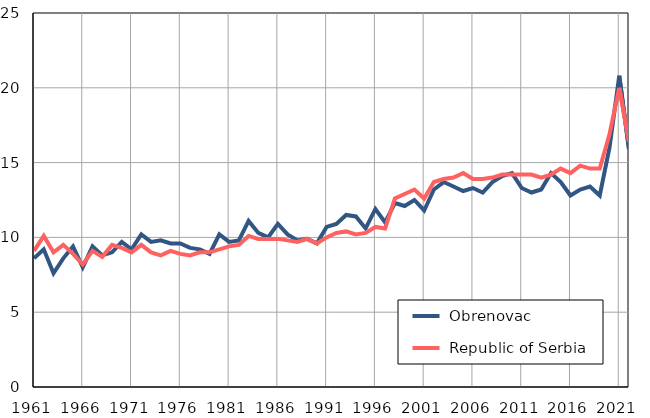
| Category |  Obrenovac |  Republic of Serbia |
|---|---|---|
| 1961.0 | 8.6 | 9.1 |
| 1962.0 | 9.2 | 10.1 |
| 1963.0 | 7.6 | 9 |
| 1964.0 | 8.6 | 9.5 |
| 1965.0 | 9.4 | 8.9 |
| 1966.0 | 8 | 8.2 |
| 1967.0 | 9.4 | 9.1 |
| 1968.0 | 8.8 | 8.7 |
| 1969.0 | 9 | 9.5 |
| 1970.0 | 9.7 | 9.3 |
| 1971.0 | 9.2 | 9 |
| 1972.0 | 10.2 | 9.5 |
| 1973.0 | 9.7 | 9 |
| 1974.0 | 9.8 | 8.8 |
| 1975.0 | 9.6 | 9.1 |
| 1976.0 | 9.6 | 8.9 |
| 1977.0 | 9.3 | 8.8 |
| 1978.0 | 9.2 | 9 |
| 1979.0 | 8.9 | 9 |
| 1980.0 | 10.2 | 9.2 |
| 1981.0 | 9.7 | 9.4 |
| 1982.0 | 9.8 | 9.5 |
| 1983.0 | 11.1 | 10.1 |
| 1984.0 | 10.3 | 9.9 |
| 1985.0 | 10 | 9.9 |
| 1986.0 | 10.9 | 9.9 |
| 1987.0 | 10.2 | 9.8 |
| 1988.0 | 9.8 | 9.7 |
| 1989.0 | 9.9 | 9.9 |
| 1990.0 | 9.6 | 9.6 |
| 1991.0 | 10.7 | 10 |
| 1992.0 | 10.9 | 10.3 |
| 1993.0 | 11.5 | 10.4 |
| 1994.0 | 11.4 | 10.2 |
| 1995.0 | 10.6 | 10.3 |
| 1996.0 | 11.9 | 10.7 |
| 1997.0 | 11 | 10.6 |
| 1998.0 | 12.3 | 12.6 |
| 1999.0 | 12.1 | 12.9 |
| 2000.0 | 12.5 | 13.2 |
| 2001.0 | 11.8 | 12.6 |
| 2002.0 | 13.2 | 13.7 |
| 2003.0 | 13.7 | 13.9 |
| 2004.0 | 13.4 | 14 |
| 2005.0 | 13.1 | 14.3 |
| 2006.0 | 13.3 | 13.9 |
| 2007.0 | 13 | 13.9 |
| 2008.0 | 13.7 | 14 |
| 2009.0 | 14.1 | 14.2 |
| 2010.0 | 14.3 | 14.2 |
| 2011.0 | 13.3 | 14.2 |
| 2012.0 | 13 | 14.2 |
| 2013.0 | 13.2 | 14 |
| 2014.0 | 14.3 | 14.2 |
| 2015.0 | 13.7 | 14.6 |
| 2016.0 | 12.8 | 14.3 |
| 2017.0 | 13.2 | 14.8 |
| 2018.0 | 13.4 | 14.6 |
| 2019.0 | 12.8 | 14.6 |
| 2020.0 | 16 | 16.9 |
| 2021.0 | 20.8 | 20 |
| 2022.0 | 15.9 | 16.4 |